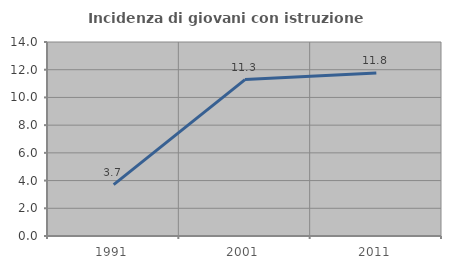
| Category | Incidenza di giovani con istruzione universitaria |
|---|---|
| 1991.0 | 3.704 |
| 2001.0 | 11.29 |
| 2011.0 | 11.765 |